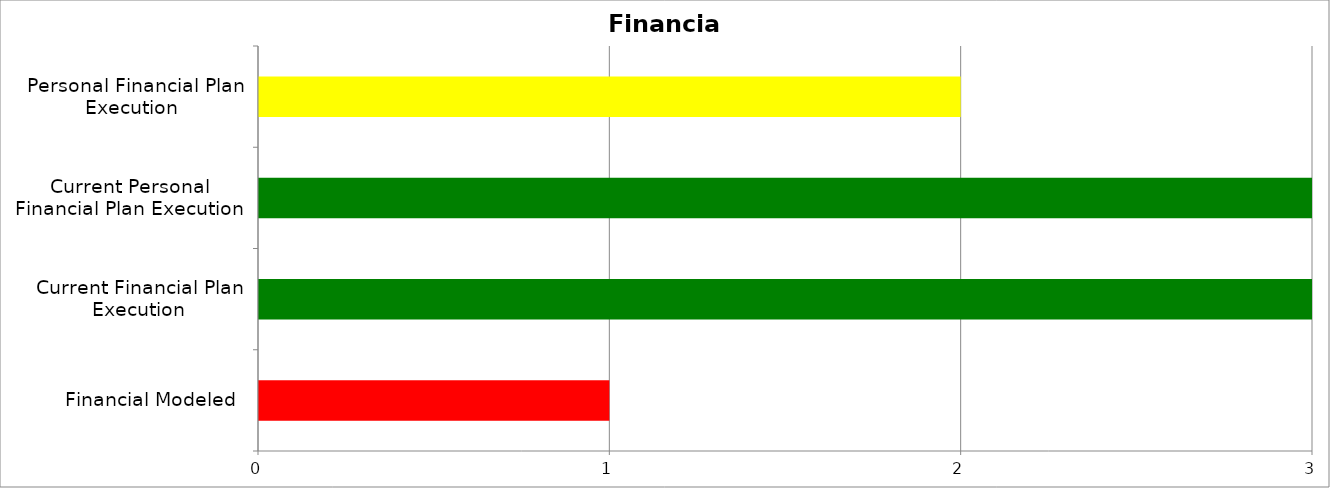
| Category | Series 0 | Series 1 | Series 2 |
|---|---|---|---|
| Financial Modeled  | 0 | 0 | 1 |
| Current Financial Plan Execution | 3 | 0 | 0 |
| Current Personal Financial Plan Execution | 3 | 0 | 0 |
| Personal Financial Plan Execution  | 0 | 2 | 0 |